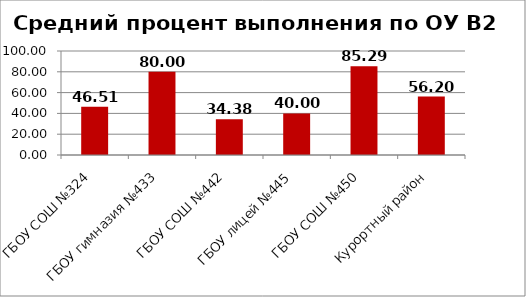
| Category | B2 |
|---|---|
| ГБОУ СОШ №324 | 46.512 |
| ГБОУ гимназия №433 | 80 |
| ГБОУ СОШ №442 | 34.375 |
| ГБОУ лицей №445 | 40 |
| ГБОУ СОШ №450 | 85.294 |
| Курортный район | 56.198 |